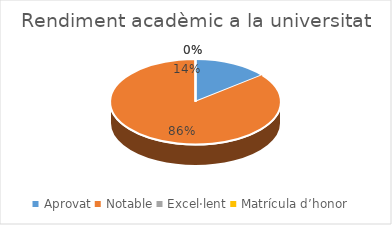
| Category | Series 0 |
|---|---|
| Aprovat | 1 |
| Notable | 6 |
| Excel·lent | 0 |
| Matrícula d’honor | 0 |